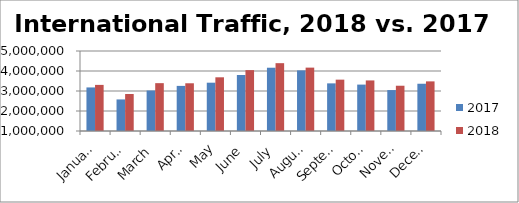
| Category | 2017 | 2018 |
|---|---|---|
| January | 3178627 | 3305517 |
| February | 2578537 | 2848777 |
| March | 3024848 | 3392371 |
| April | 3255391 | 3386294 |
| May | 3415301 | 3684989 |
| June | 3798894 | 4044616 |
| July | 4164112 | 4391517 |
| August | 4030519 | 4168958 |
| September | 3381573 | 3567578 |
| October | 3320230 | 3528348 |
| November | 3046581 | 3263457 |
| December | 3363073 | 3480985 |